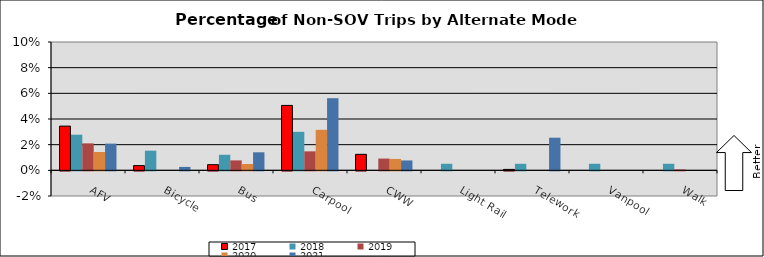
| Category | 2017 | 2018 | 2019 | 2020 | 2021 |
|---|---|---|---|---|---|
| AFV | 0.034 | 0.028 | 0.021 | 0.014 | 0.021 |
| Bicycle | 0.004 | 0.015 | 0 | 0 | 0.003 |
| Bus | 0.004 | 0.012 | 0.008 | 0.005 | 0.014 |
| Carpool | 0.051 | 0.03 | 0.015 | 0.032 | 0.056 |
| CWW | 0.012 | 0 | 0.009 | 0.009 | 0.008 |
| Light Rail | 0 | 0.005 | 0 | 0 | 0 |
| Telework | 0.001 | 0.005 | 0 | 0 | 0.025 |
| Vanpool | 0 | 0.005 | 0 | 0 | 0 |
| Walk | 0 | 0.005 | 0.001 | 0 | 0 |